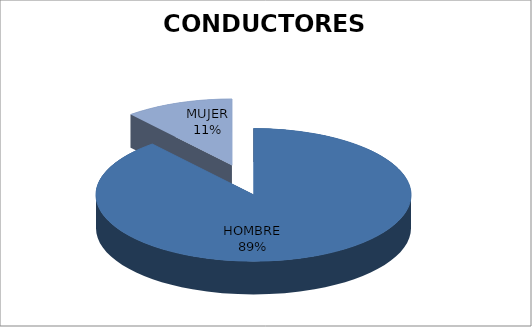
| Category | E.E. |
|---|---|
| HOMBRE | 32 |
| MUJER | 4 |